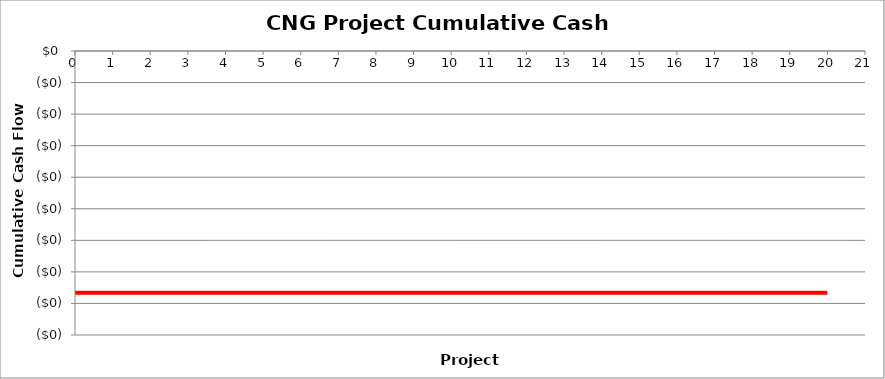
| Category | Cumulative Cash Flow |
|---|---|
| 0.0 | -0.383 |
| 1.0 | -0.383 |
| 2.0 | -0.383 |
| 3.0 | -0.383 |
| 4.0 | -0.383 |
| 5.0 | -0.383 |
| 6.0 | -0.383 |
| 7.0 | -0.383 |
| 8.0 | -0.383 |
| 9.0 | -0.383 |
| 10.0 | -0.383 |
| 11.0 | -0.383 |
| 12.0 | -0.383 |
| 13.0 | -0.383 |
| 14.0 | -0.383 |
| 15.0 | -0.383 |
| 16.0 | -0.383 |
| 17.0 | -0.383 |
| 18.0 | -0.383 |
| 19.0 | -0.383 |
| 20.0 | -0.383 |